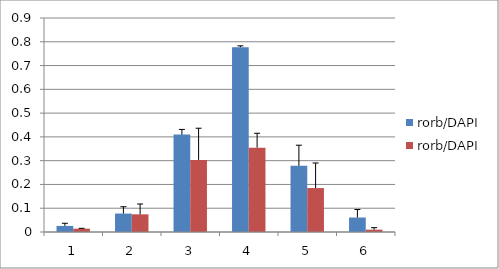
| Category | rorb/DAPI |
|---|---|
| 0 | 0.014 |
| 1 | 0.074 |
| 2 | 0.303 |
| 3 | 0.355 |
| 4 | 0.185 |
| 5 | 0.01 |